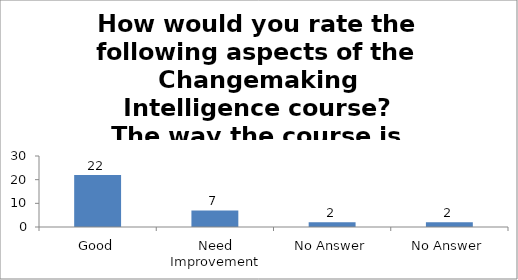
| Category | How would you rate the following aspects of the Changemaking Intelligence course?
The way the course is carried out. |
|---|---|
| Good | 22 |
| Need Improvement | 7 |
| No Answer | 2 |
| No Answer | 2 |